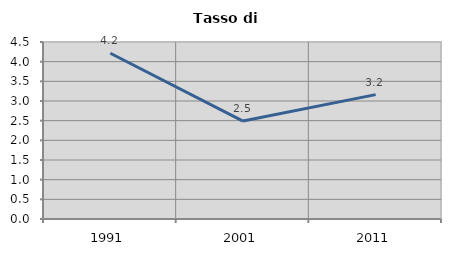
| Category | Tasso di disoccupazione   |
|---|---|
| 1991.0 | 4.215 |
| 2001.0 | 2.49 |
| 2011.0 | 3.162 |